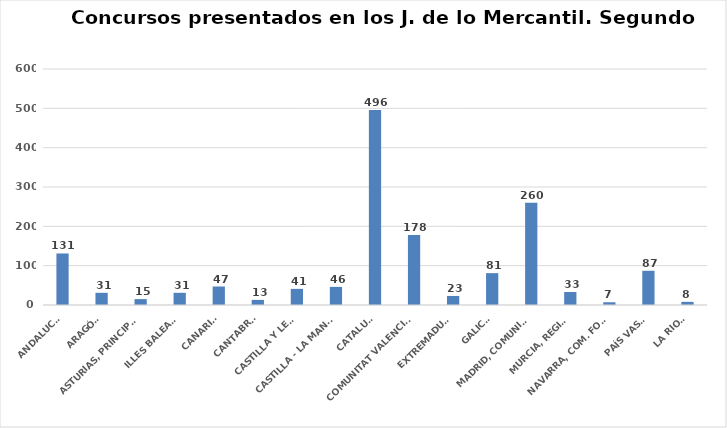
| Category | Series 0 |
|---|---|
| ANDALUCÍA | 131 |
| ARAGÓN | 31 |
| ASTURIAS, PRINCIPADO | 15 |
| ILLES BALEARS | 31 |
| CANARIAS | 47 |
| CANTABRIA | 13 |
| CASTILLA Y LEÓN | 41 |
| CASTILLA - LA MANCHA | 46 |
| CATALUÑA | 496 |
| COMUNITAT VALENCIANA | 178 |
| EXTREMADURA | 23 |
| GALICIA | 81 |
| MADRID, COMUNIDAD | 260 |
| MURCIA, REGIÓN | 33 |
| NAVARRA, COM. FORAL | 7 |
| PAÍS VASCO | 87 |
| LA RIOJA | 8 |